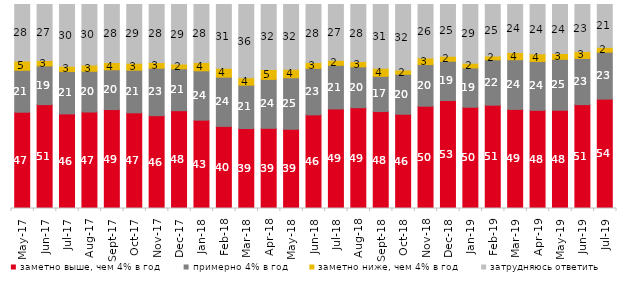
| Category | заметно выше, чем 4% в год | примерно 4% в год | заметно ниже, чем 4% в год | затрудняюсь ответить |
|---|---|---|---|---|
| 2017-05-01 | 47.2 | 20.55 | 4.55 | 27.7 |
| 2017-06-01 | 50.9 | 18.95 | 2.65 | 27.45 |
| 2017-07-01 | 46.35 | 20.8 | 2.5 | 30.3 |
| 2017-08-01 | 47.3 | 19.95 | 3.1 | 29.65 |
| 2017-09-01 | 48.5 | 19.5 | 3.55 | 28.45 |
| 2017-10-01 | 46.9 | 20.9 | 3.45 | 28.75 |
| 2017-11-01 | 45.5 | 23.25 | 2.85 | 28.4 |
| 2017-12-01 | 47.95 | 20.55 | 2.3 | 29.2 |
| 2018-01-01 | 43.3 | 24.2 | 4.05 | 28.45 |
| 2018-02-01 | 40.25 | 24.15 | 4.35 | 31.25 |
| 2018-03-01 | 39.2 | 21.25 | 3.7 | 35.85 |
| 2018-04-01 | 39.3 | 24 | 4.85 | 31.85 |
| 2018-05-01 | 38.8 | 25.3 | 4.15 | 31.75 |
| 2018-06-01 | 45.9 | 22.8 | 2.85 | 28.45 |
| 2018-07-01 | 48.8 | 21.4 | 2.45 | 27.35 |
| 2018-08-01 | 49.4 | 20.05 | 2.55 | 28 |
| 2018-09-01 | 47.5 | 17.25 | 4 | 31.2 |
| 2018-10-01 | 46.2 | 19.6 | 2.15 | 32.05 |
| 2018-11-01 | 50.15 | 20.409 | 3.244 | 26.198 |
| 2018-12-01 | 52.95 | 19.25 | 2.4 | 25.4 |
| 2019-01-01 | 49.65 | 19.25 | 2.3 | 28.8 |
| 2019-02-01 | 50.65 | 22.25 | 1.9 | 25.2 |
| 2019-03-01 | 48.583 | 24.366 | 3.531 | 23.521 |
| 2019-04-01 | 48.119 | 23.96 | 3.762 | 24.158 |
| 2019-05-01 | 48.143 | 25.012 | 2.823 | 24.022 |
| 2019-06-01 | 50.923 | 22.643 | 3.392 | 23.042 |
| 2019-07-01 | 53.614 | 23.02 | 2.327 | 21.04 |